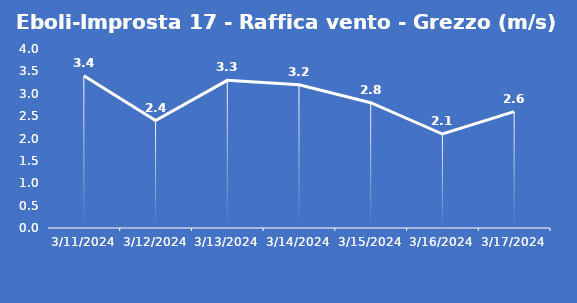
| Category | Eboli-Improsta 17 - Raffica vento - Grezzo (m/s) |
|---|---|
| 3/11/24 | 3.4 |
| 3/12/24 | 2.4 |
| 3/13/24 | 3.3 |
| 3/14/24 | 3.2 |
| 3/15/24 | 2.8 |
| 3/16/24 | 2.1 |
| 3/17/24 | 2.6 |